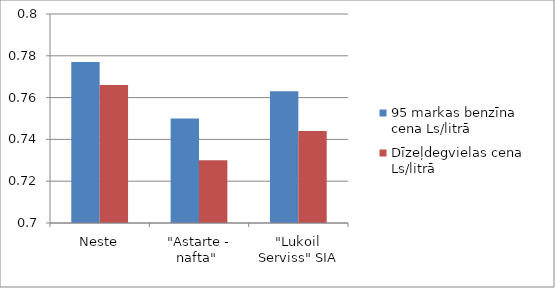
| Category | 95 markas benzīna cena Ls/litrā | Dīzeļdegvielas cena Ls/litrā |
|---|---|---|
| Neste | 0.777 | 0.766 |
| "Astarte - nafta"  | 0.75 | 0.73 |
| "Lukoil Serviss" SIA | 0.763 | 0.744 |